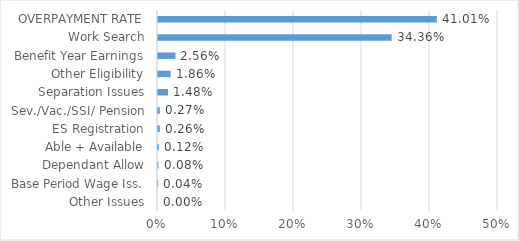
| Category | Series 0 |
|---|---|
| Other Issues | 0 |
| Base Period Wage Iss. | 0 |
| Dependant Allow | 0.001 |
| Able + Available | 0.001 |
| ES Registration | 0.003 |
| Sev./Vac./SSI/ Pension | 0.003 |
| Separation Issues | 0.015 |
| Other Eligibility | 0.019 |
| Benefit Year Earnings | 0.026 |
| Work Search | 0.344 |
| OVERPAYMENT RATE | 0.41 |